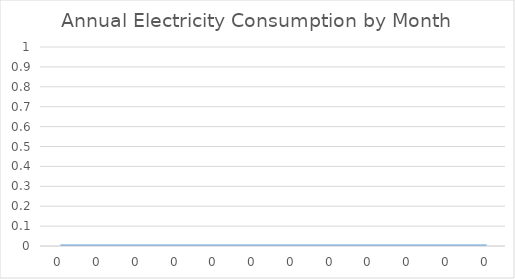
| Category | 0 |
|---|---|
| 0.0 | 0 |
| 0.0 | 0 |
| 0.0 | 0 |
| 0.0 | 0 |
| 0.0 | 0 |
| 0.0 | 0 |
| 0.0 | 0 |
| 0.0 | 0 |
| 0.0 | 0 |
| 0.0 | 0 |
| 0.0 | 0 |
| 0.0 | 0 |